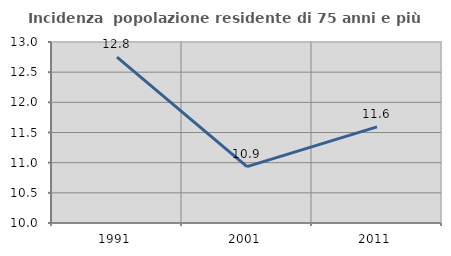
| Category | Incidenza  popolazione residente di 75 anni e più |
|---|---|
| 1991.0 | 12.75 |
| 2001.0 | 10.933 |
| 2011.0 | 11.594 |